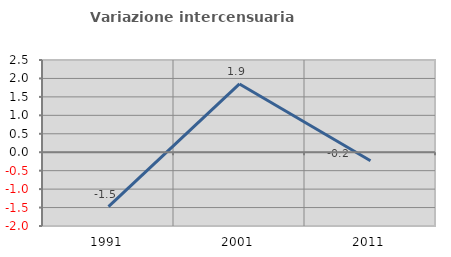
| Category | Variazione intercensuaria annua |
|---|---|
| 1991.0 | -1.477 |
| 2001.0 | 1.852 |
| 2011.0 | -0.23 |